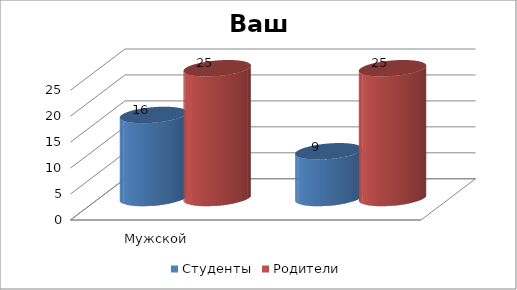
| Category | Студенты | Родители |
|---|---|---|
| Мужской | 16 | 25 |